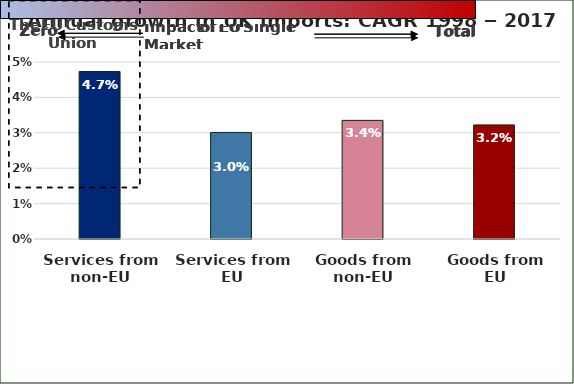
| Category | CAGR 1998/99 - 2017 |
|---|---|
| Services from non-EU | 0.047 |
| Services from EU | 0.03 |
| Goods from non-EU | 0.034 |
| Goods from EU | 0.032 |